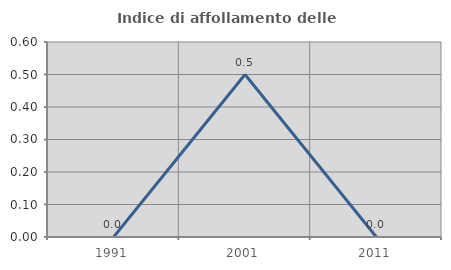
| Category | Indice di affollamento delle abitazioni  |
|---|---|
| 1991.0 | 0 |
| 2001.0 | 0.5 |
| 2011.0 | 0 |